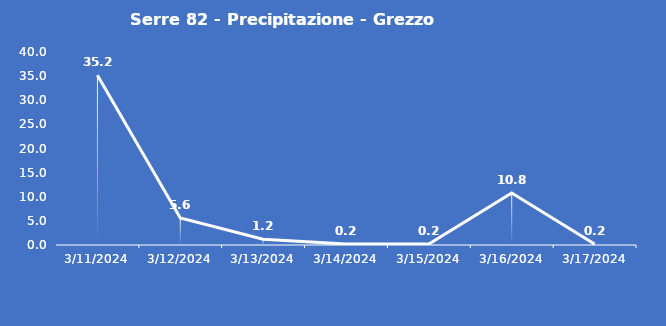
| Category | Serre 82 - Precipitazione - Grezzo (mm) |
|---|---|
| 3/11/24 | 35.2 |
| 3/12/24 | 5.6 |
| 3/13/24 | 1.2 |
| 3/14/24 | 0.2 |
| 3/15/24 | 0.2 |
| 3/16/24 | 10.8 |
| 3/17/24 | 0.2 |